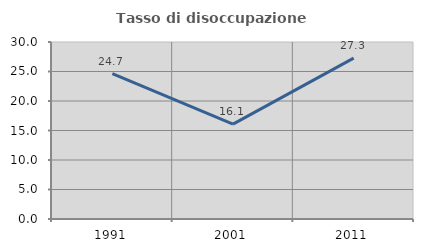
| Category | Tasso di disoccupazione giovanile  |
|---|---|
| 1991.0 | 24.659 |
| 2001.0 | 16.08 |
| 2011.0 | 27.273 |